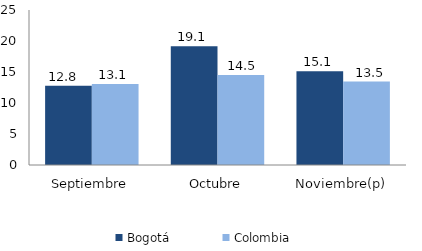
| Category | Bogotá | Colombia |
|---|---|---|
| Septiembre | 12.765 | 13.073 |
| Octubre | 19.145 | 14.502 |
| Noviembre(p) | 15.121 | 13.463 |